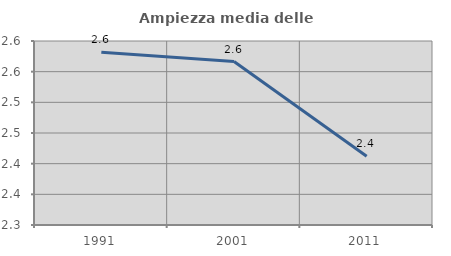
| Category | Ampiezza media delle famiglie |
|---|---|
| 1991.0 | 2.582 |
| 2001.0 | 2.566 |
| 2011.0 | 2.412 |